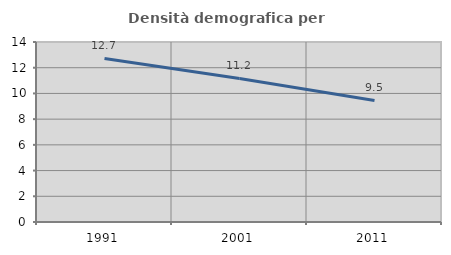
| Category | Densità demografica |
|---|---|
| 1991.0 | 12.719 |
| 2001.0 | 11.166 |
| 2011.0 | 9.45 |